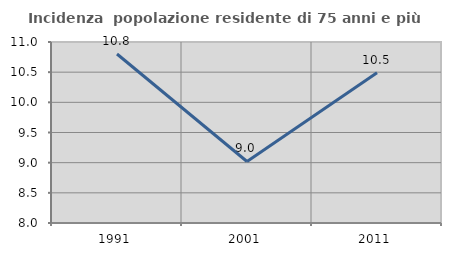
| Category | Incidenza  popolazione residente di 75 anni e più |
|---|---|
| 1991.0 | 10.801 |
| 2001.0 | 9.02 |
| 2011.0 | 10.491 |